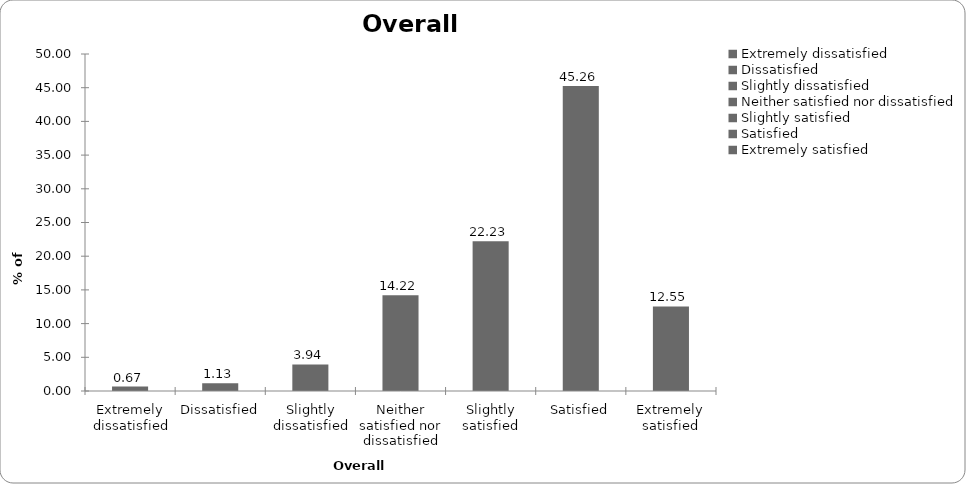
| Category | Overall satisfaction |
|---|---|
| Extremely dissatisfied | 0.668 |
| Dissatisfied | 1.135 |
| Slightly dissatisfied | 3.939 |
| Neither satisfied nor dissatisfied | 14.219 |
| Slightly satisfied | 22.23 |
| Satisfied | 45.26 |
| Extremely satisfied | 12.55 |